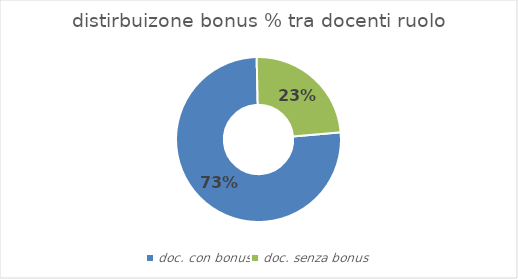
| Category | Series 0 |
|---|---|
| doc. con bonus | 0.729 |
| doc. senza bonus | 0.23 |